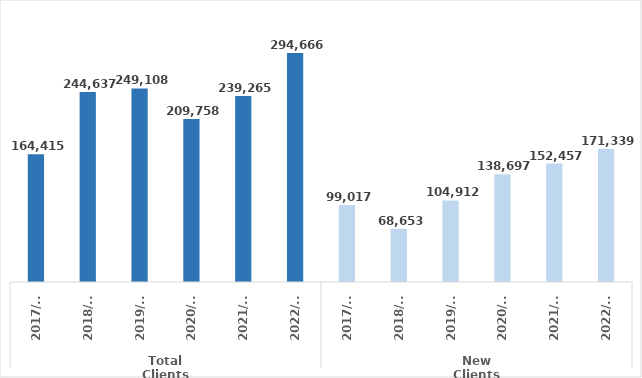
| Category | Series 0 |
|---|---|
| 0 | 164415 |
| 1 | 244637 |
| 2 | 249108.245 |
| 3 | 209758.35 |
| 4 | 239265.096 |
| 5 | 294666 |
| 6 | 99017 |
| 7 | 68653 |
| 8 | 104911.725 |
| 9 | 138697.15 |
| 10 | 152456.508 |
| 11 | 171339 |